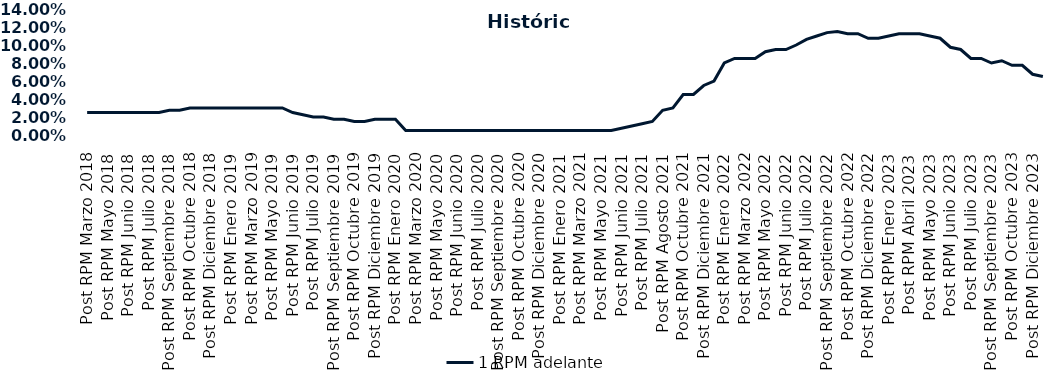
| Category | 1 RPM adelante |
|---|---|
| Post RPM Marzo 2018 | 0.025 |
| Pre RPM Mayo 2018 | 0.025 |
| Post RPM Mayo 2018 | 0.025 |
| Pre RPM Junio 2018 | 0.025 |
| Post RPM Junio 2018 | 0.025 |
| Pre RPM Julio 2018 | 0.025 |
| Post RPM Julio 2018 | 0.025 |
| Pre RPM Septiembre 2018 | 0.025 |
| Post RPM Septiembre 2018 | 0.028 |
| Pre RPM Octubre 2018 | 0.028 |
| Post RPM Octubre 2018 | 0.03 |
| Pre RPM Diciembre 2018 | 0.03 |
| Post RPM Diciembre 2018 | 0.03 |
| Pre RPM Enero 2019 | 0.03 |
| Post RPM Enero 2019 | 0.03 |
| Pre RPM Marzo 2019 | 0.03 |
| Post RPM Marzo 2019 | 0.03 |
| Pre RPM Mayo 2019 | 0.03 |
| Post RPM Mayo 2019 | 0.03 |
| Pre RPM Junio 2019 | 0.03 |
| Post RPM Junio 2019 | 0.025 |
| Pre RPM Julio 2019 | 0.022 |
| Post RPM Julio 2019 | 0.02 |
| Pre RPM Septiembre 2019 | 0.02 |
| Post RPM Septiembre 2019 | 0.018 |
| Pre RPM Octubre 2019 | 0.018 |
| Post RPM Octubre 2019 | 0.015 |
| Pre RPM Diciembre 2019 | 0.015 |
| Post RPM Diciembre 2019 | 0.018 |
| Pre RPM Enero 2020 | 0.018 |
| Post RPM Enero 2020 | 0.018 |
| Pre RPM Marzo 2020 | 0.005 |
| Post RPM Marzo 2020 | 0.005 |
| Pre RPM Mayo 2020 | 0.005 |
| Post RPM Mayo 2020 | 0.005 |
| Pre RPM Junio 2020 | 0.005 |
| Post RPM Junio 2020 | 0.005 |
| Pre RPM Julio 2020 | 0.005 |
| Post RPM Julio 2020 | 0.005 |
| Pre RPM Septiembre 2020 | 0.005 |
| Post RPM Septiembre 2020 | 0.005 |
| Pre RPM Octubre 2020 | 0.005 |
| Post RPM Octubre 2020 | 0.005 |
| Pre RPM Diciembre 2020 | 0.005 |
| Post RPM Diciembre 2020 | 0.005 |
| Pre RPM Enero 2021 | 0.005 |
| Post RPM Enero 2021 | 0.005 |
| Pre RPM Marzo 2021 | 0.005 |
| Post RPM Marzo 2021 | 0.005 |
| Pre RPM Mayo 2021 | 0.005 |
| Post RPM Mayo 2021 | 0.005 |
| Pre RPM Junio 2021 | 0.005 |
| Post RPM Junio 2021 | 0.008 |
| Pre RPM Julio 2021 | 0.01 |
| Post RPM Julio 2021 | 0.012 |
| Pre RPM Agosto 2021 | 0.015 |
| Post RPM Agosto 2021 | 0.028 |
| Pre RPM Octubre 2021 | 0.03 |
| Post RPM Octubre 2021 | 0.045 |
| Pre RPM Diciembre 2021 | 0.045 |
| Post RPM Diciembre 2021 | 0.055 |
| Pre RPM Enero 2022 | 0.06 |
| Post RPM Enero 2022 | 0.08 |
| Pre RPM Marzo 2022 | 0.085 |
| Post RPM Marzo 2022 | 0.085 |
| Pre RPM Mayo 2022 | 0.085 |
| Post RPM Mayo 2022 | 0.092 |
| Pre RPM Junio 2022 | 0.095 |
| Post RPM Junio 2022 | 0.095 |
| Pre RPM Julio 2022 | 0.1 |
| Post RPM Julio 2022 | 0.106 |
| Pre RPM Septiembre 2022 | 0.11 |
| Post RPM Septiembre 2022 | 0.114 |
| Pre RPM Octubre 2022 | 0.115 |
| Post RPM Octubre 2022 | 0.112 |
| Pre RPM Diciembre 2022 | 0.112 |
| Post RPM Diciembre 2022 | 0.108 |
| Pre RPM Enero 2023 | 0.108 |
| Post RPM Enero 2023 | 0.11 |
| Pre RPM Abril 2023 | 0.112 |
| Post RPM Abril 2023 | 0.112 |
| Pre RPM Mayo 2023 | 0.112 |
| Post RPM Mayo 2023 | 0.11 |
| Pre RPM Junio 2023 | 0.108 |
| Post RPM Junio 2023 | 0.098 |
| Pre RPM Julio 2023 | 0.095 |
| Post RPM Julio 2023 | 0.085 |
| Pre RPM Septiembre 2023 | 0.085 |
| Post RPM Septiembre 2023 | 0.08 |
| Pre RPM Octubre 2023 | 0.082 |
| Post RPM Octubre 2023 | 0.078 |
| Pre RPM Diciembre 2023 | 0.078 |
| Post RPM Diciembre 2023 | 0.068 |
| Pre RPM Enero 2024 | 0.065 |